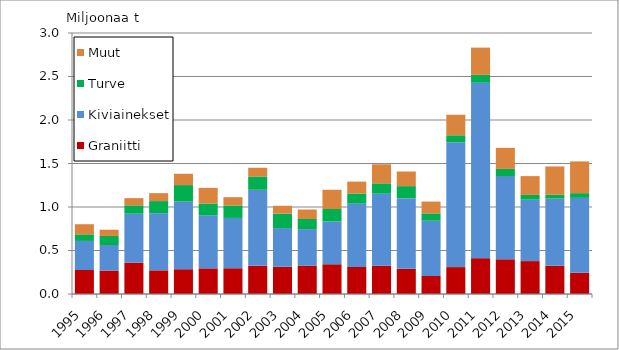
| Category | Graniitti | Kiviainekset | Turve | Muut |
|---|---|---|---|---|
| 1995.0 | 276 | 334 | 76 | 116 |
| 1996.0 | 269 | 294 | 104 | 72 |
| 1997.0 | 360 | 563 | 96 | 83 |
| 1998.0 | 272 | 656 | 140 | 91 |
| 1999.0 | 285 | 778 | 189 | 130 |
| 2000.0 | 295 | 610 | 135 | 180 |
| 2001.0 | 296 | 578 | 144 | 95 |
| 2002.0 | 324 | 874 | 153 | 100 |
| 2003.0 | 313 | 445 | 166 | 90 |
| 2004.0 | 324 | 422 | 116 | 109 |
| 2005.0 | 342 | 492 | 143 | 221 |
| 2006.0 | 311 | 728 | 116 | 137 |
| 2007.0 | 325 | 829 | 118 | 219 |
| 2008.0 | 290 | 812 | 138 | 168 |
| 2009.0 | 208 | 634 | 84.48 | 136 |
| 2010.0 | 309 | 1436 | 79.322 | 236 |
| 2011.0 | 412 | 2016 | 91 | 313 |
| 2012.0 | 399 | 956 | 83 | 242 |
| 2013.0 | 378 | 706 | 55 | 216 |
| 2014.0 | 324 | 772 | 44 | 326 |
| 2015.0 | 244 | 861 | 54 | 365 |